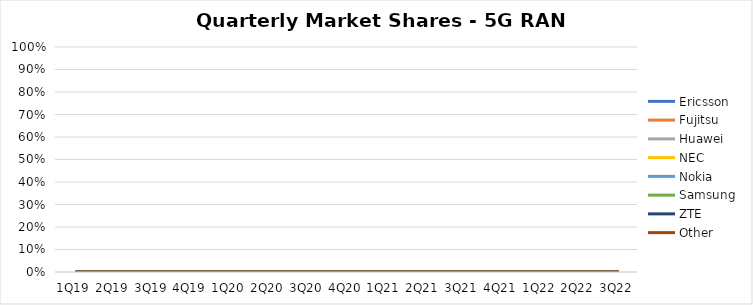
| Category | Ericsson | Fujitsu | Huawei | NEC | Nokia | Samsung | ZTE | Other |
|---|---|---|---|---|---|---|---|---|
| 1Q19 | 0 | 0 | 0 | 0 | 0 | 0 | 0 | 0 |
| 2Q19 | 0 | 0 | 0 | 0 | 0 | 0 | 0 | 0 |
| 3Q19 | 0 | 0 | 0 | 0 | 0 | 0 | 0 | 0 |
| 4Q19 | 0 | 0 | 0 | 0 | 0 | 0 | 0 | 0 |
| 1Q20 | 0 | 0 | 0 | 0 | 0 | 0 | 0 | 0 |
| 2Q20 | 0 | 0 | 0 | 0 | 0 | 0 | 0 | 0 |
| 3Q20 | 0 | 0 | 0 | 0 | 0 | 0 | 0 | 0 |
| 4Q20 | 0 | 0 | 0 | 0 | 0 | 0 | 0 | 0 |
| 1Q21 | 0 | 0 | 0 | 0 | 0 | 0 | 0 | 0 |
| 2Q21 | 0 | 0 | 0 | 0 | 0 | 0 | 0 | 0 |
| 3Q21 | 0 | 0 | 0 | 0 | 0 | 0 | 0 | 0 |
| 4Q21 | 0 | 0 | 0 | 0 | 0 | 0 | 0 | 0 |
| 1Q22 | 0 | 0 | 0 | 0 | 0 | 0 | 0 | 0 |
| 2Q22 | 0 | 0 | 0 | 0 | 0 | 0 | 0 | 0 |
| 3Q22 | 0 | 0 | 0 | 0 | 0 | 0 | 0 | 0 |